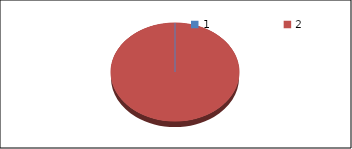
| Category | Series1 |
|---|---|
| 0 | 0 |
| 1 | 54.9 |